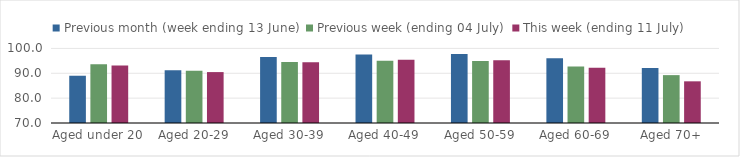
| Category | Previous month (week ending 13 June) | Previous week (ending 04 July) | This week (ending 11 July) |
|---|---|---|---|
| Aged under 20 | 89.013 | 93.627 | 93.125 |
| Aged 20-29 | 91.261 | 90.971 | 90.482 |
| Aged 30-39 | 96.543 | 94.498 | 94.445 |
| Aged 40-49 | 97.602 | 95.067 | 95.405 |
| Aged 50-59 | 97.732 | 94.903 | 95.29 |
| Aged 60-69 | 96.091 | 92.709 | 92.212 |
| Aged 70+ | 92.097 | 89.259 | 86.765 |